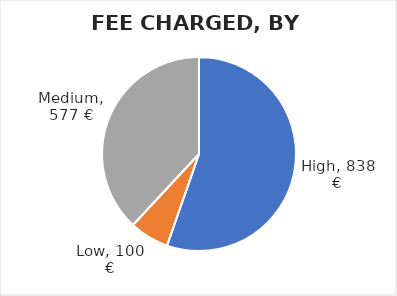
| Category | Total fee |
|---|---|
| High | 837.917 |
| Low | 99.583 |
| Medium | 576.5 |